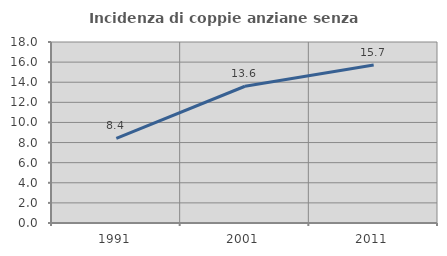
| Category | Incidenza di coppie anziane senza figli  |
|---|---|
| 1991.0 | 8.413 |
| 2001.0 | 13.598 |
| 2011.0 | 15.714 |